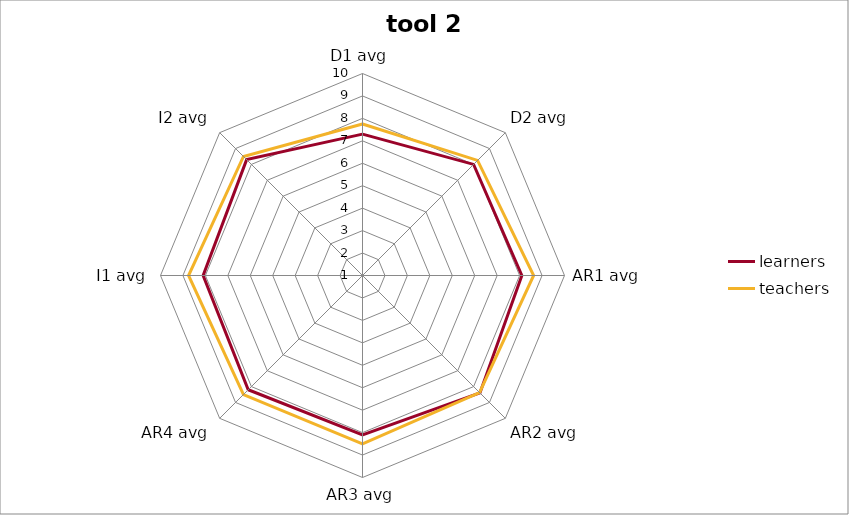
| Category | learners | teachers |
|---|---|---|
| D1 avg | 7.3 | 7.75 |
| D2 avg | 8 | 8.25 |
| AR1 avg | 8.1 | 8.625 |
| AR2 avg | 8.4 | 8.375 |
| AR3 avg | 8.1 | 8.5 |
| AR4 avg | 8.2 | 8.5 |
| I1 avg | 8.1 | 8.75 |
| I2 avg | 8.3 | 8.5 |